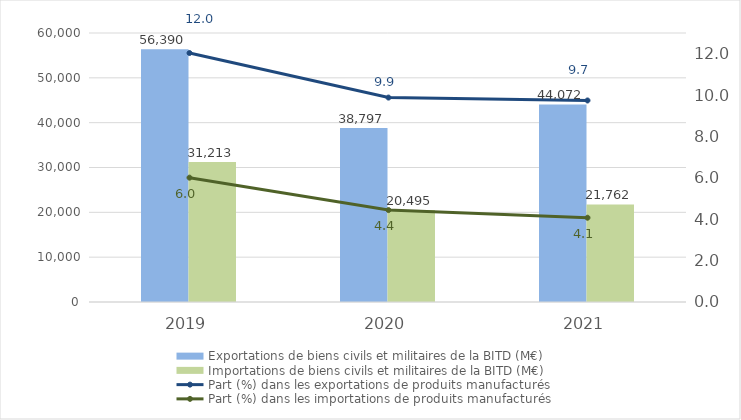
| Category | Exportations de biens civils et militaires de la BITD (M€) | Importations de biens civils et militaires de la BITD (M€) |
|---|---|---|
| 2019.0 | 56389.9 | 31213.2 |
| 2020.0 | 38796.8 | 20494.9 |
| 2021.0 | 44072.2 | 21762.3 |